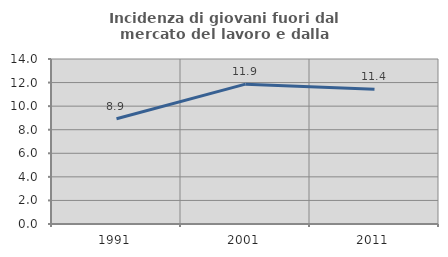
| Category | Incidenza di giovani fuori dal mercato del lavoro e dalla formazione  |
|---|---|
| 1991.0 | 8.929 |
| 2001.0 | 11.866 |
| 2011.0 | 11.434 |